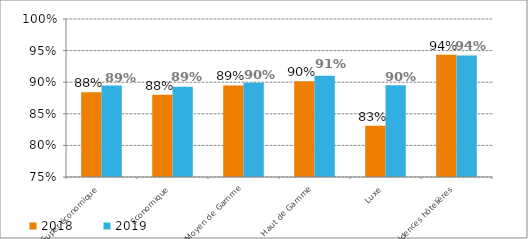
| Category | 2018 | 2019 |
|---|---|---|
| Super-économique | 0.884 | 0.895 |
| Economique | 0.88 | 0.893 |
| Moyen de Gamme | 0.895 | 0.899 |
| Haut de Gamme | 0.902 | 0.91 |
| Luxe | 0.831 | 0.895 |
| Résidences hôtelières | 0.944 | 0.942 |